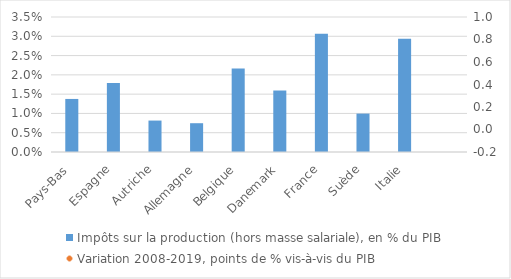
| Category | Impôts sur la production (hors masse salariale), en % du PIB |
|---|---|
| Pays-Bas | 0.014 |
| Espagne | 0.018 |
| Autriche | 0.008 |
| Allemagne | 0.007 |
| Belgique | 0.022 |
| Danemark | 0.016 |
| France | 0.031 |
| Suède | 0.01 |
| Italie | 0.029 |